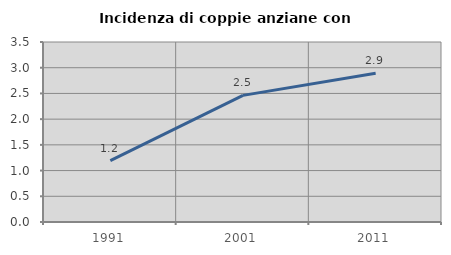
| Category | Incidenza di coppie anziane con figli |
|---|---|
| 1991.0 | 1.194 |
| 2001.0 | 2.463 |
| 2011.0 | 2.893 |